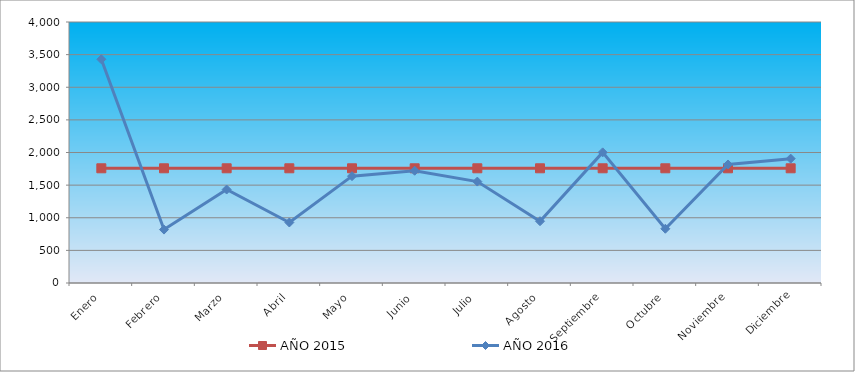
| Category | AÑO 2015 | AÑO 2016 |
|---|---|---|
| Enero | 1757.945 | 3428.432 |
| Febrero | 1757.945 | 818.683 |
| Marzo | 1757.945 | 1432.695 |
| Abril | 1757.945 | 927.414 |
| Mayo | 1757.945 | 1637.365 |
| Junio | 1757.945 | 1720.513 |
| Julio | 1757.945 | 1554.218 |
| Agosto | 1757.945 | 946.602 |
| Septiembre | 1757.945 | 2001.935 |
| Octubre | 1757.945 | 831.475 |
| Noviembre | 1757.945 | 1816.452 |
| Diciembre | 1757.945 | 1905.996 |